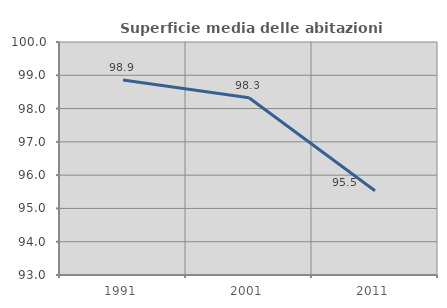
| Category | Superficie media delle abitazioni occupate |
|---|---|
| 1991.0 | 98.86 |
| 2001.0 | 98.326 |
| 2011.0 | 95.532 |